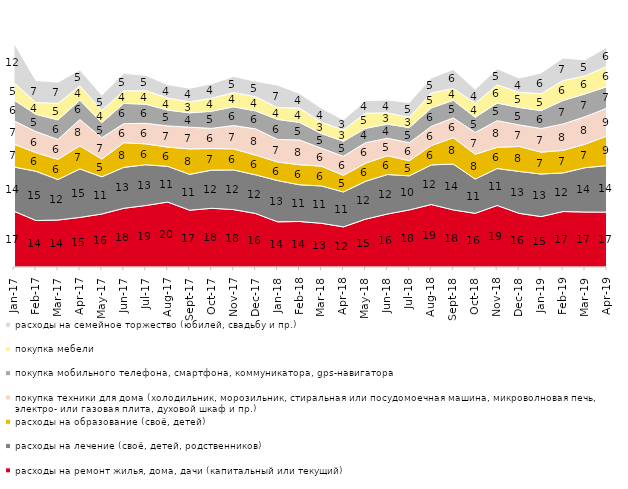
| Category | расходы на ремонт жилья, дома, дачи (капитальный или текущий) | расходы на лечение (своё, детей, родственников) | расходы на образование (своё, детей) | покупка техники для дома (холодильник, морозильник, стиральная или посудомоечная машина, микроволновая печь, электро- или газовая плита, духовой шкаф и пр.) | покупка мобильного телефона, смартфона, коммуникатора, gps-навигатора | покупка мебели | расходы на семейное торжество (юбилей, свадьбу и пр.) |
|---|---|---|---|---|---|---|---|
| 2017-01-01 | 17.1 | 13.55 | 7 | 7.2 | 6.35 | 5.3 | 12.1 |
| 2017-02-01 | 14.25 | 15.1 | 5.7 | 6.45 | 5.3 | 3.6 | 6.75 |
| 2017-03-01 | 14.4 | 12.4 | 6.2 | 6.1 | 6 | 5.05 | 6.5 |
| 2017-04-01 | 15.2 | 14.85 | 7.1 | 8.05 | 5.95 | 4.35 | 4.9 |
| 2017-05-01 | 16.25 | 11.4 | 5.45 | 6.55 | 4.6 | 3.75 | 4.65 |
| 2017-06-01 | 18 | 12.55 | 7.55 | 5.85 | 6.2 | 3.85 | 5.35 |
| 2017-07-01 | 18.85 | 12.5 | 6.4 | 6.3 | 5.85 | 4.15 | 4.7 |
| 2017-08-01 | 19.9 | 10.95 | 5.9 | 6.5 | 4.85 | 3.7 | 4.1 |
| 2017-09-01 | 17.4 | 11 | 7.8 | 6.65 | 4.4 | 3.4 | 4.15 |
| 2017-10-01 | 18 | 11.7 | 6.6 | 6.2 | 5.25 | 4 | 4.4 |
| 2017-11-01 | 17.6 | 12.15 | 6.45 | 7.15 | 5.75 | 4.4 | 4.9 |
| 2017-12-01 | 16.4 | 11.85 | 6.05 | 8.05 | 5.5 | 4.35 | 4.75 |
| 2018-01-01 | 13.85 | 12.65 | 5.7 | 6.9 | 6.15 | 3.65 | 6.85 |
| 2018-02-01 | 13.95 | 11.25 | 6.15 | 7.6 | 5.35 | 4.4 | 4.45 |
| 2018-03-01 | 13.4 | 11.45 | 6.05 | 5.5 | 4.5 | 3.45 | 4.3 |
| 2018-04-01 | 12.3 | 10.7 | 5.1 | 5.85 | 4.6 | 3.45 | 3.1 |
| 2018-05-01 | 14.65 | 11.6 | 5.55 | 6.3 | 4.4 | 4.65 | 3.8 |
| 2018-06-01 | 16.25 | 12.1 | 5.75 | 5.35 | 4.35 | 3.45 | 3.95 |
| 2018-07-01 | 17.5 | 10.45 | 4.65 | 5.5 | 4.65 | 3.1 | 4.55 |
| 2018-08-01 | 19.15 | 12.15 | 5.9 | 5.9 | 5.65 | 4.6 | 4.6 |
| 2018-09-01 | 17.5 | 14.05 | 8.1 | 6.05 | 5.4 | 3.6 | 5.85 |
| 2018-10-01 | 16.45 | 10.5 | 7.6 | 6.7 | 4.65 | 4.3 | 4.25 |
| 2018-11-01 | 18.862 | 11.327 | 6.487 | 8.184 | 5.389 | 5.589 | 4.94 |
| 2018-12-01 | 16.45 | 12.85 | 7.65 | 6.6 | 5.35 | 4.65 | 4.35 |
| 2019-01-01 | 15.45 | 13.05 | 6.7 | 7.25 | 5.5 | 5.15 | 6.4 |
| 2019-02-01 | 17 | 11.85 | 6.9 | 8.1 | 7.2 | 6.1 | 6.9 |
| 2019-03-01 | 16.857 | 13.575 | 7.21 | 8.404 | 7.011 | 5.52 | 4.923 |
| 2019-04-01 | 16.832 | 14.257 | 9.059 | 8.564 | 6.584 | 6.238 | 5.891 |